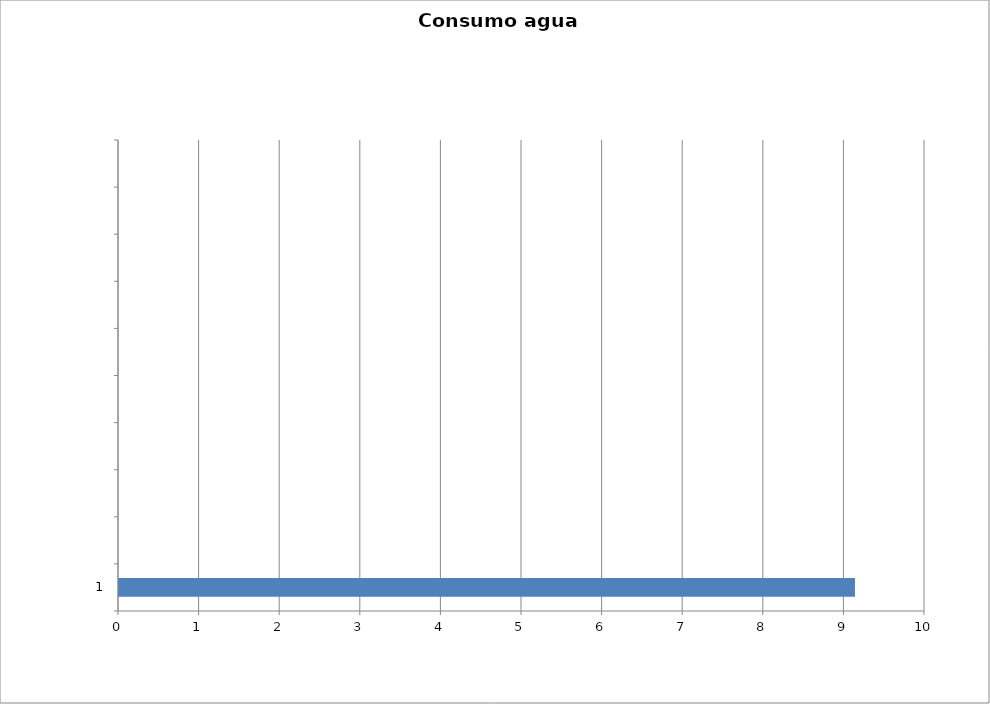
| Category | Series 0 |
|---|---|
| 1 | 9.131 |